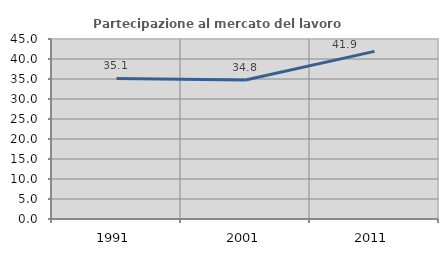
| Category | Partecipazione al mercato del lavoro  femminile |
|---|---|
| 1991.0 | 35.133 |
| 2001.0 | 34.768 |
| 2011.0 | 41.91 |